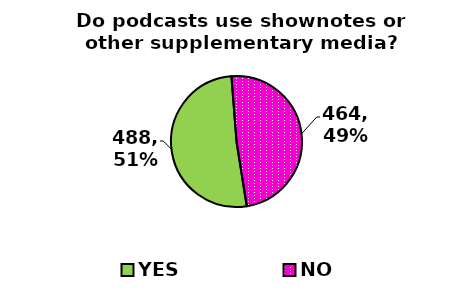
| Category | Series 0 |
|---|---|
| YES | 488 |
| NO | 464 |